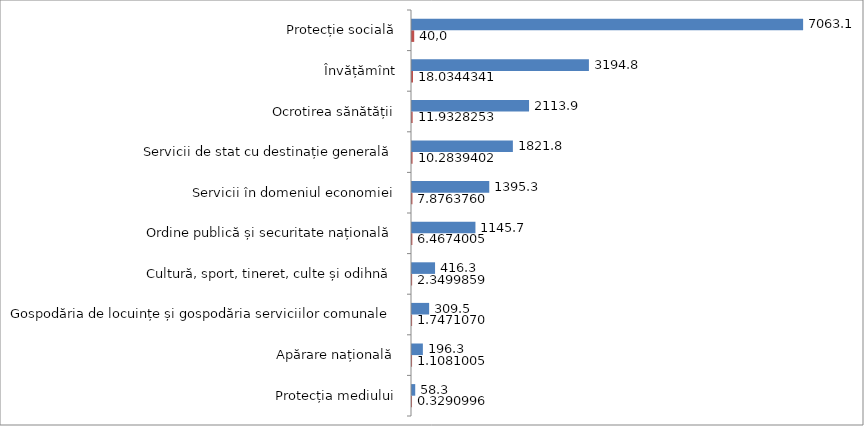
| Category | Series 1 | Series 0 |
|---|---|---|
| Protecția mediului | 0.329 | 58.3 |
| Apărare națională | 1.108 | 196.3 |
| Gospodăria de locuințe și gospodăria serviciilor comunale | 1.747 | 309.5 |
| Cultură, sport, tineret, culte și odihnă | 2.35 | 416.3 |
| Ordine publică și securitate națională | 6.467 | 1145.7 |
| Servicii în domeniul economiei | 7.876 | 1395.3 |
| Servicii de stat cu destinație generală | 10.284 | 1821.8 |
| Ocrotirea sănătății | 11.933 | 2113.9 |
| Învățămînt | 18.034 | 3194.8 |
| Protecție socială | 39.871 | 7063.1 |